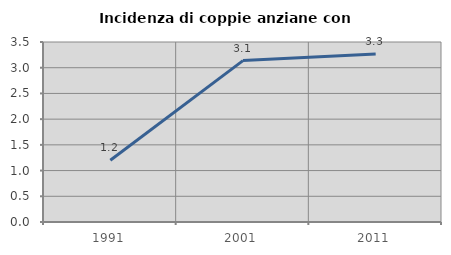
| Category | Incidenza di coppie anziane con figli |
|---|---|
| 1991.0 | 1.202 |
| 2001.0 | 3.138 |
| 2011.0 | 3.265 |